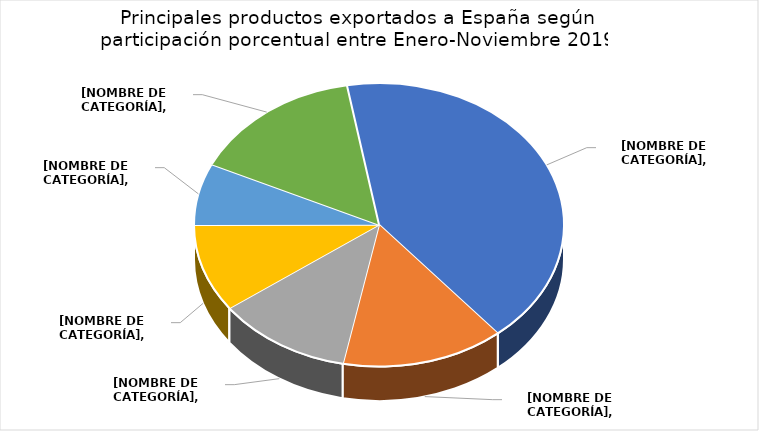
| Category | Series 0 |
|---|---|
| Camarones, cultivados, sin ahumar, congelados. | 0.417 |
| Desperdicios y desechos, de cobre. | 0.142 |
| Calabazas y calabacines frescas o refrigeradas. | 0.118 |
| Harina de pescado. | 0.1 |
| Camarones y langostinos congelados, excepto ahumados. | 0.07 |
| 18 productos restantes | 0.152 |